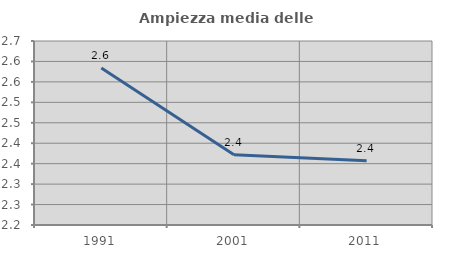
| Category | Ampiezza media delle famiglie |
|---|---|
| 1991.0 | 2.584 |
| 2001.0 | 2.372 |
| 2011.0 | 2.357 |